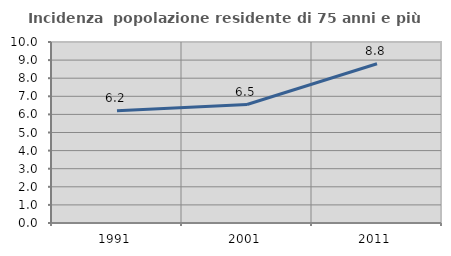
| Category | Incidenza  popolazione residente di 75 anni e più |
|---|---|
| 1991.0 | 6.196 |
| 2001.0 | 6.544 |
| 2011.0 | 8.798 |